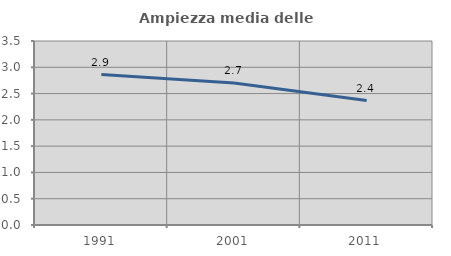
| Category | Ampiezza media delle famiglie |
|---|---|
| 1991.0 | 2.862 |
| 2001.0 | 2.7 |
| 2011.0 | 2.367 |